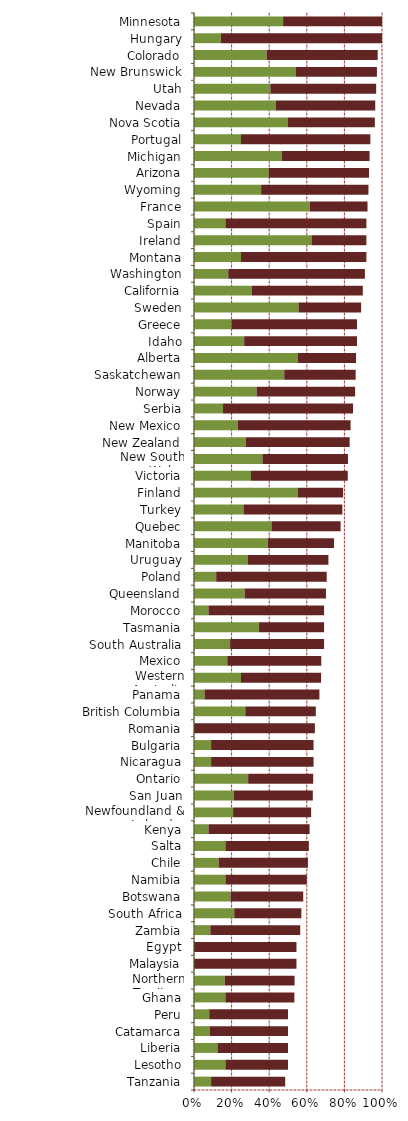
| Category |   Encourages Investment |   Not a Deterrent to Investment |
|---|---|---|
| Tanzania | 0.091 | 0.394 |
| Lesotho | 0.167 | 0.333 |
| Liberia | 0.125 | 0.375 |
| Catamarca | 0.083 | 0.417 |
| Peru | 0.081 | 0.419 |
| Ghana | 0.167 | 0.367 |
| Northern Territory | 0.163 | 0.372 |
| Malaysia | 0 | 0.545 |
| Egypt | 0 | 0.545 |
| Zambia | 0.087 | 0.478 |
| South Africa | 0.214 | 0.357 |
| Botswana | 0.194 | 0.387 |
| Namibia | 0.167 | 0.433 |
| Chile | 0.131 | 0.475 |
| Salta | 0.167 | 0.444 |
| Kenya | 0.077 | 0.538 |
| Newfoundland & Labrador | 0.208 | 0.415 |
| San Juan | 0.211 | 0.421 |
| Ontario | 0.288 | 0.346 |
| Nicaragua | 0.091 | 0.545 |
| Bulgaria | 0.091 | 0.545 |
| Romania | 0 | 0.643 |
| British Columbia | 0.273 | 0.375 |
| Panama | 0.056 | 0.611 |
| Western Australia | 0.25 | 0.426 |
| Mexico | 0.177 | 0.5 |
| South Australia | 0.192 | 0.5 |
| Tasmania | 0.346 | 0.346 |
| Morocco | 0.077 | 0.615 |
| Queensland | 0.269 | 0.433 |
| Poland | 0.118 | 0.588 |
| Uruguay | 0.286 | 0.429 |
| Manitoba | 0.392 | 0.353 |
| Quebec | 0.412 | 0.368 |
| Turkey | 0.263 | 0.526 |
| Finland | 0.552 | 0.241 |
| Victoria | 0.303 | 0.515 |
| New South Wales | 0.364 | 0.455 |
| New Zealand | 0.276 | 0.552 |
| New Mexico | 0.233 | 0.6 |
| Serbia | 0.154 | 0.692 |
| Norway | 0.333 | 0.524 |
| Saskatchewan | 0.48 | 0.38 |
| Alberta | 0.552 | 0.31 |
| Idaho | 0.267 | 0.6 |
| Greece | 0.2 | 0.667 |
| Sweden | 0.556 | 0.333 |
| California | 0.308 | 0.59 |
| Washington | 0.182 | 0.727 |
| Montana | 0.25 | 0.667 |
| Ireland | 0.625 | 0.292 |
| Spain | 0.167 | 0.75 |
| France | 0.615 | 0.308 |
| Wyoming | 0.357 | 0.571 |
| Arizona | 0.397 | 0.534 |
| Michigan | 0.467 | 0.467 |
| Portugal | 0.25 | 0.688 |
| Nova Scotia | 0.5 | 0.462 |
| Nevada | 0.435 | 0.529 |
| Utah | 0.406 | 0.563 |
| New Brunswick | 0.541 | 0.432 |
| Colorado | 0.386 | 0.591 |
| Hungary | 0.143 | 0.857 |
| Minnesota | 0.474 | 0.526 |